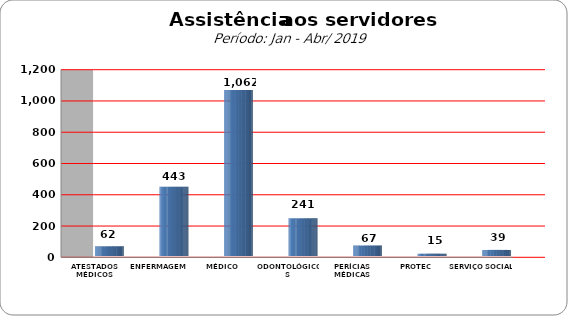
| Category | Series 0 |
|---|---|
| ATESTADOS MÉDICOS | 62 |
| ENFERMAGEM | 443 |
| MÉDICO | 1062 |
| ODONTOLÓGICOS | 241 |
| PERÍCIAS MÉDICAS | 67 |
| PROTEC | 15 |
| SERVIÇO SOCIAL | 39 |